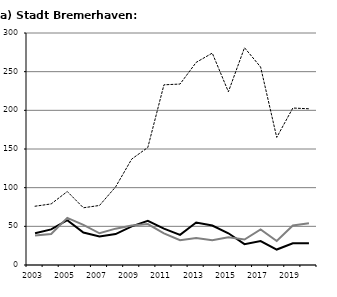
| Category | BHV j Unternehmen | BHV j Verbraucher | BHV j Übrige |
|---|---|---|---|
| 2003.0 | 41 | 76 | 38 |
| 2004.0 | 46 | 79 | 40 |
| 2005.0 | 58 | 95 | 61 |
| 2006.0 | 42 | 74 | 52 |
| 2007.0 | 37 | 77 | 41 |
| 2008.0 | 40 | 101 | 47 |
| 2009.0 | 50 | 137 | 51 |
| 2010.0 | 57 | 152 | 53 |
| 2011.0 | 47 | 233 | 41 |
| 2012.0 | 39 | 234 | 32 |
| 2013.0 | 55 | 262 | 35 |
| 2014.0 | 51 | 274 | 32 |
| 2015.0 | 41 | 224 | 36 |
| 2016.0 | 27 | 281 | 33 |
| 2017.0 | 31 | 256 | 46 |
| 2018.0 | 20 | 165 | 31 |
| 2019.0 | 28 | 203 | 51 |
| 2020.0 | 28 | 202 | 54 |